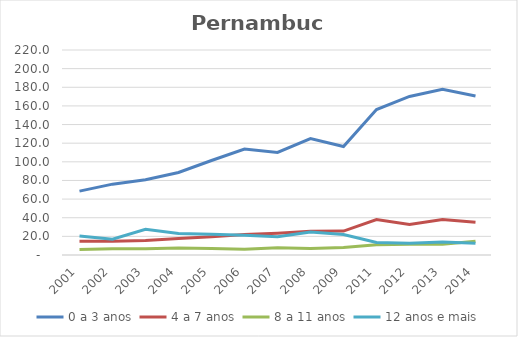
| Category | 0 a 3 anos | 4 a 7 anos | 8 a 11 anos | 12 anos e mais |
|---|---|---|---|---|
| 2001.0 | 68.559 | 14.764 | 5.917 | 20.393 |
| 2002.0 | 76.043 | 14.675 | 6.605 | 16.897 |
| 2003.0 | 80.744 | 15.521 | 6.772 | 27.69 |
| 2004.0 | 88.586 | 17.725 | 7.454 | 22.985 |
| 2005.0 | 101.447 | 19.565 | 7.011 | 22.159 |
| 2006.0 | 113.722 | 21.872 | 6.273 | 21.122 |
| 2007.0 | 110.082 | 23.436 | 7.677 | 19.657 |
| 2008.0 | 124.955 | 25.397 | 6.945 | 24.781 |
| 2009.0 | 116.464 | 25.674 | 8.09 | 21.967 |
| 2011.0 | 156.058 | 38.037 | 11.051 | 13.52 |
| 2012.0 | 170.128 | 32.617 | 11.628 | 12.496 |
| 2013.0 | 177.81 | 38.02 | 11.602 | 13.98 |
| 2014.0 | 170.698 | 35.059 | 14.842 | 12.484 |